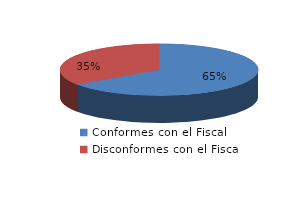
| Category | Series 0 |
|---|---|
| 0 | 137 |
| 1 | 73 |